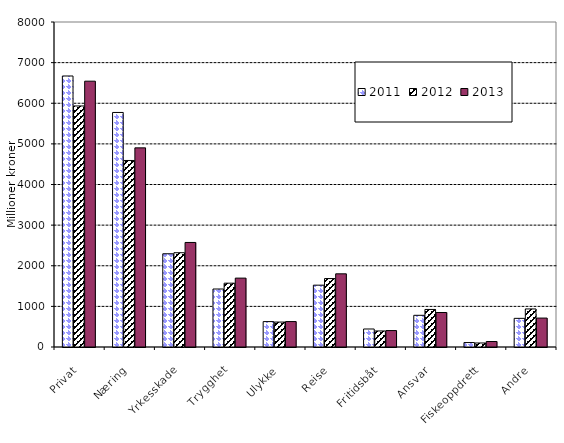
| Category | 2011 | 2012 | 2013 |
|---|---|---|---|
| Privat | 6670.835 | 5933.149 | 6543.143 |
| Næring | 5773.185 | 4591.221 | 4901.714 |
| Yrkesskade | 2295.151 | 2320.418 | 2573.205 |
| Trygghet | 1427.556 | 1570.886 | 1695.525 |
| Ulykke | 625.021 | 613.828 | 625.949 |
| Reise | 1522.136 | 1684.937 | 1801.514 |
| Fritidsbåt | 443.461 | 394.804 | 404.534 |
| Ansvar | 780.301 | 924.24 | 849.168 |
| Fiskeoppdrett | 109.484 | 99.057 | 134.623 |
| Andre | 705.084 | 936.878 | 712.197 |